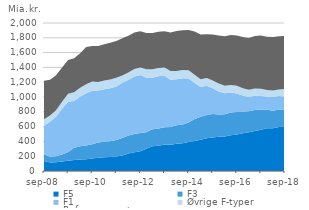
| Category | F5 | F3 | F1 | Øvrige F-typer | Referencerente |
|---|---|---|---|---|---|
| sep-08 | 135.481 | 91.043 | 384.496 | 87.963 | 521.749 |
| dec-08 | 115.537 | 76.953 | 473.184 | 84.184 | 484.118 |
| mar-09 | 118.192 | 82.541 | 533.465 | 88.109 | 473.255 |
| jun-09 | 126.918 | 94.78 | 619.713 | 95.863 | 462.345 |
| sep-09 | 138.721 | 117.5 | 681.017 | 107.509 | 456.101 |
| dec-09 | 149.195 | 163.843 | 632.264 | 118.485 | 458.825 |
| mar-10 | 154.732 | 179.133 | 672.317 | 120.159 | 466.466 |
| jun-10 | 159.527 | 186.295 | 704.48 | 122.713 | 503.744 |
| sep-10 | 168.509 | 194.632 | 721.701 | 124.904 | 479.099 |
| dec-10 | 179.791 | 204.248 | 703.051 | 116.993 | 486.447 |
| mar-11 | 186.601 | 210.174 | 706.889 | 119.089 | 490.827 |
| jun-11 | 188.545 | 213.649 | 715.768 | 119.384 | 494.378 |
| sep-11 | 195.655 | 222.307 | 723.27 | 119.48 | 496.586 |
| dec-11 | 208.802 | 235.475 | 748.393 | 99.45 | 501.323 |
| mar-12 | 236.509 | 243.67 | 753.373 | 98.307 | 496.509 |
| jun-12 | 251.982 | 248.031 | 775.95 | 101.743 | 493.467 |
| sep-12 | 268.505 | 245.753 | 781.569 | 103.575 | 488.53 |
| dec-12 | 300.131 | 224.17 | 737.113 | 113.175 | 491.663 |
| mar-13 | 333.969 | 231.124 | 695.932 | 114.289 | 488.374 |
| jun-13 | 341.165 | 233.952 | 703.75 | 114.026 | 488.701 |
| sep-13 | 357.227 | 234.914 | 693.579 | 113.867 | 490.377 |
| dec-13 | 356.401 | 237.184 | 639.576 | 116.653 | 522.57 |
| mar-14 | 367.5 | 249.981 | 621.277 | 112.551 | 539.75 |
| jun-14 | 375.288 | 253.781 | 622.749 | 112.399 | 538.415 |
| sep-14 | 391.275 | 265.197 | 593.827 | 111.054 | 544.317 |
| dec-14 | 406.065 | 296.028 | 487.943 | 111.735 | 582.493 |
| mar-15 | 423.724 | 308.261 | 403.123 | 103.276 | 607.485 |
| jun-15 | 440.972 | 314.286 | 398.083 | 104.666 | 590.278 |
| sep-15 | 454.319 | 315.489 | 349.478 | 103.411 | 622.994 |
| dec-15 | 462.05 | 300.442 | 311.599 | 107.789 | 649.228 |
| mar-16 | 465.644 | 302.503 | 281.583 | 103.809 | 668.945 |
| jun-16 | 484.757 | 306.185 | 270.312 | 102.427 | 673.977 |
| sep-16 | 493.935 | 304.672 | 249.215 | 103.655 | 679.628 |
| dec-16 | 510.686 | 289.108 | 219.084 | 98.365 | 694.126 |
| mar-17 | 523.025 | 284.011 | 194.476 | 95.654 | 699.306 |
| jun-17 | 541.989 | 281.964 | 192.306 | 98.355 | 710.591 |
| sep-17 | 556.692 | 273.087 | 184.295 | 97.613 | 717.722 |
| dec-17 | 576.394 | 251.28 | 174.657 | 92.873 | 718.147 |
| mar-18 | 576.923 | 238.106 | 185.318 | 88.105 | 722.579 |
| jun-18 | 595.896 | 234.709 | 184.57 | 87.196 | 717.733 |
| sep-18 | 603.549 | 223.581 | 177.384 | 103.922 | 718.648 |